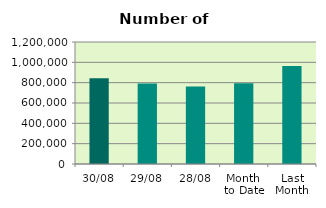
| Category | Series 0 |
|---|---|
| 30/08 | 843374 |
| 29/08 | 791256 |
| 28/08 | 761912 |
| Month 
to Date | 793933.727 |
| Last
Month | 964212.818 |